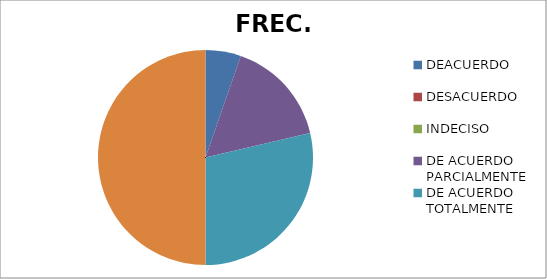
| Category | FREC. | % |
|---|---|---|
| DEACUERDO | 50 | 0.11 |
| DESACUERDO | 0 | 0 |
| INDECISO | 0 | 0 |
| DE ACUERDO PARCIALMENTE | 150 | 32 |
| DE ACUERDO TOTALMENTE | 269 | 57 |
| TOTAL | 469 | 1 |